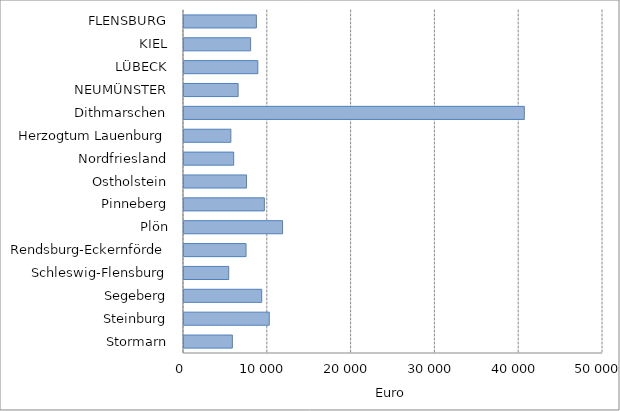
| Category | Euro |
|---|---|
| Stormarn | 5771.741 |
| Steinburg | 10174.749 |
| Segeberg | 9271.341 |
| Schleswig-Flensburg | 5335.058 |
| Rendsburg-Eckernförde | 7402.325 |
| Plön | 11763.313 |
| Pinneberg | 9590.72 |
| Ostholstein | 7462.582 |
| Nordfriesland | 5930.664 |
| Herzogtum Lauenburg | 5590.156 |
| Dithmarschen | 40609.282 |
| NEUMÜNSTER | 6458.315 |
| LÜBECK | 8809.474 |
| KIEL | 7949.194 |
| FLENSBURG | 8637.56 |